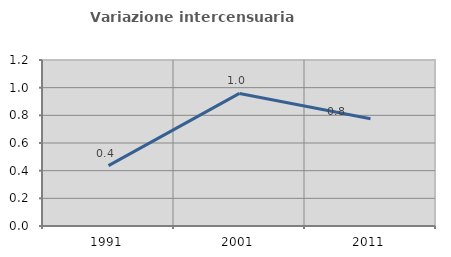
| Category | Variazione intercensuaria annua |
|---|---|
| 1991.0 | 0.436 |
| 2001.0 | 0.958 |
| 2011.0 | 0.776 |